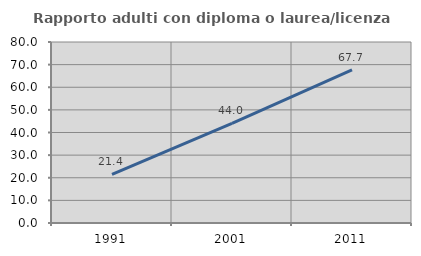
| Category | Rapporto adulti con diploma o laurea/licenza media  |
|---|---|
| 1991.0 | 21.446 |
| 2001.0 | 44.048 |
| 2011.0 | 67.66 |